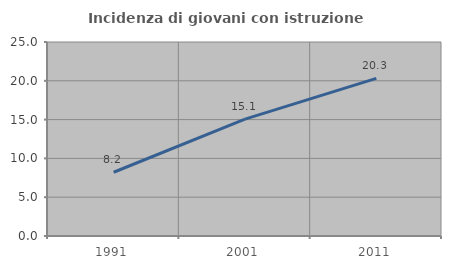
| Category | Incidenza di giovani con istruzione universitaria |
|---|---|
| 1991.0 | 8.217 |
| 2001.0 | 15.061 |
| 2011.0 | 20.315 |